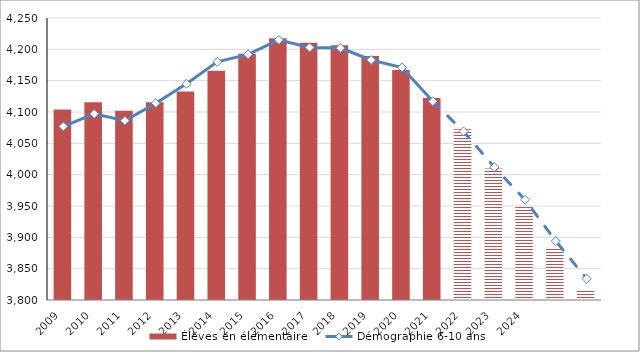
| Category | Élèves en élémentaire |
|---|---|
| 2009.0 | 4103.879 |
| 2010.0 | 4115.513 |
| 2011.0 | 4102.091 |
| 2012.0 | 4115.673 |
| 2013.0 | 4132.604 |
| 2014.0 | 4165.676 |
| 2015.0 | 4192.953 |
| 2016.0 | 4217.528 |
| 2017.0 | 4210.357 |
| 2018.0 | 4206.599 |
| 2019.0 | 4189.443 |
| 2020.0 | 4166.95 |
| 2021.0 | 4122.426 |
| 2022.0 | 4072.644 |
| 2023.0 | 4009.853 |
| 2024.0 | 3948.903 |